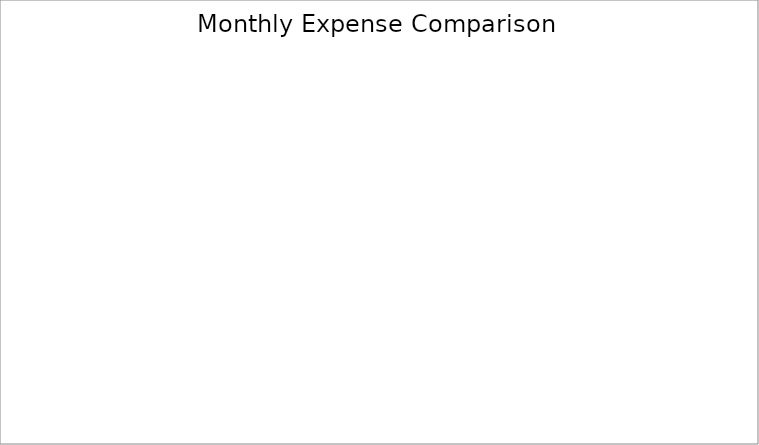
| Category | Series 0 |
|---|---|
| Housing | 0 |
| Transportation | 0 |
| Insurance | 0 |
| Loans | 0 |
| Food | 0 |
| Savings/Investments | 0 |
| Children | 0 |
| Personal | 0 |